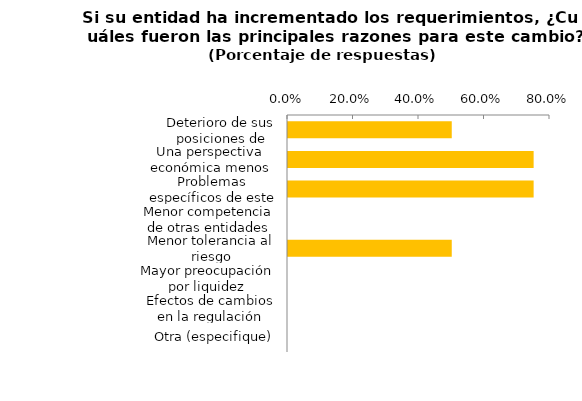
| Category | Series 0 |
|---|---|
| Deterioro de sus posiciones de balance | 0.5 |
| Una perspectiva económica menos favorable o incierta | 0.75 |
| Problemas específicos de este segmento | 0.75 |
| Menor competencia de otras entidades | 0 |
| Menor tolerancia al riesgo | 0.5 |
| Mayor preocupación por liquidez | 0 |
| Efectos de cambios en la regulación | 0 |
| Otra (especifique) | 0 |